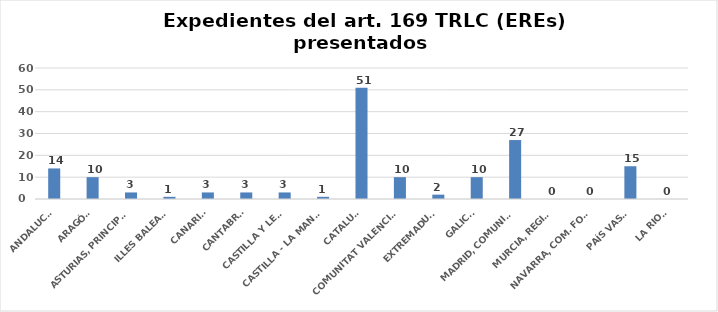
| Category | Series 0 |
|---|---|
| ANDALUCÍA | 14 |
| ARAGÓN | 10 |
| ASTURIAS, PRINCIPADO | 3 |
| ILLES BALEARS | 1 |
| CANARIAS | 3 |
| CANTABRIA | 3 |
| CASTILLA Y LEÓN | 3 |
| CASTILLA - LA MANCHA | 1 |
| CATALUÑA | 51 |
| COMUNITAT VALENCIANA | 10 |
| EXTREMADURA | 2 |
| GALICIA | 10 |
| MADRID, COMUNIDAD | 27 |
| MURCIA, REGIÓN | 0 |
| NAVARRA, COM. FORAL | 0 |
| PAÍS VASCO | 15 |
| LA RIOJA | 0 |